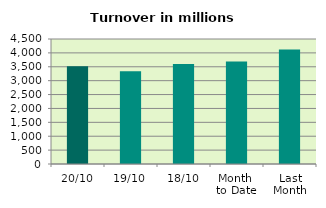
| Category | Series 0 |
|---|---|
| 20/10 | 3514.625 |
| 19/10 | 3335.652 |
| 18/10 | 3599.674 |
| Month 
to Date | 3690.024 |
| Last
Month | 4119.728 |